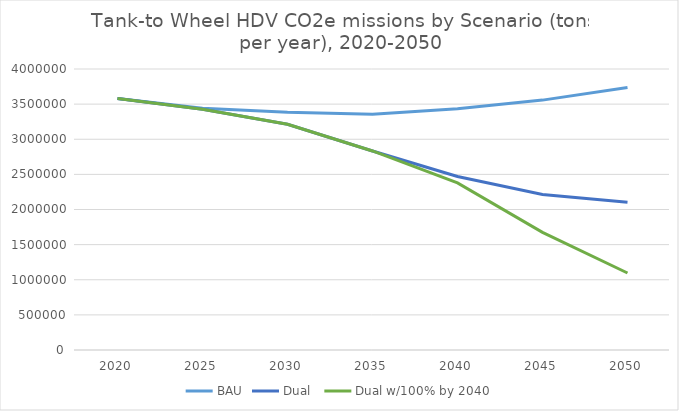
| Category | BAU | Dual  | Dual w/100% by 2040 |
|---|---|---|---|
| 2020.0 | 3581577.285 | 3581577.285 | 3581577.285 |
| 2025.0 | 3442085.675 | 3426620.894 | 3426620.894 |
| 2030.0 | 3384273.022 | 3213671.406 | 3213671.406 |
| 2035.0 | 3357418.699 | 2833425.887 | 2833425.887 |
| 2040.0 | 3432957.239 | 2469157.688 | 2379578.038 |
| 2045.0 | 3557147.985 | 2214645.937 | 1674808.697 |
| 2050.0 | 3737825.705 | 2103001.924 | 1095926.928 |